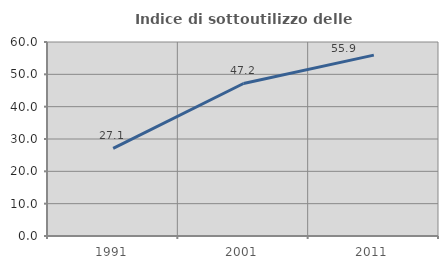
| Category | Indice di sottoutilizzo delle abitazioni  |
|---|---|
| 1991.0 | 27.083 |
| 2001.0 | 47.17 |
| 2011.0 | 55.932 |